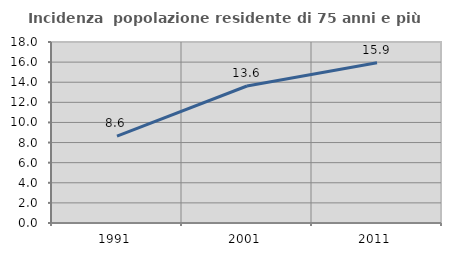
| Category | Incidenza  popolazione residente di 75 anni e più |
|---|---|
| 1991.0 | 8.631 |
| 2001.0 | 13.623 |
| 2011.0 | 15.936 |